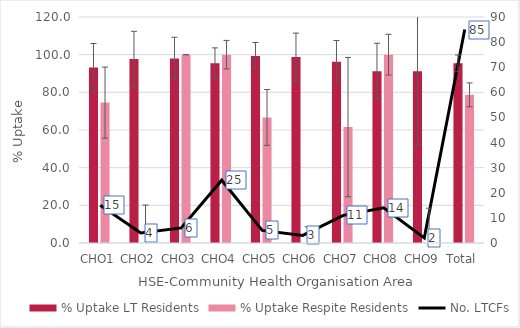
| Category | % Uptake LT Residents | % Uptake Respite Residents |
|---|---|---|
| CHO1 | 93.182 | 74.545 |
| CHO2 | 97.701 | 0 |
| CHO3 | 97.98 | 100 |
| CHO4 | 95.379 | 100 |
| CHO5 | 99.333 | 66.667 |
| CHO6 | 98.718 | 0 |
| CHO7 | 96.175 | 61.538 |
| CHO8 | 91.244 | 100 |
| CHO9 | 91.176 | 0 |
| Total | 95.392 | 78.689 |